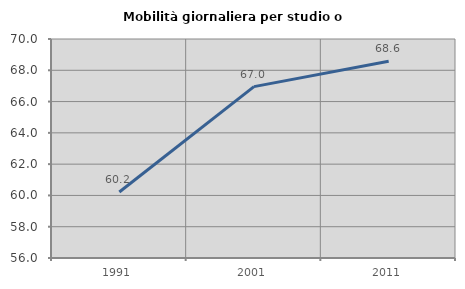
| Category | Mobilità giornaliera per studio o lavoro |
|---|---|
| 1991.0 | 60.221 |
| 2001.0 | 66.957 |
| 2011.0 | 68.578 |